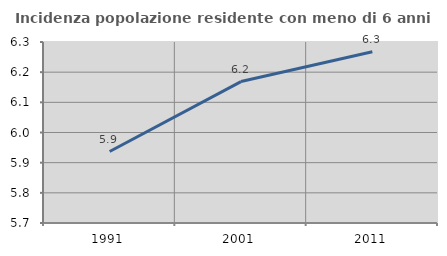
| Category | Incidenza popolazione residente con meno di 6 anni |
|---|---|
| 1991.0 | 5.937 |
| 2001.0 | 6.169 |
| 2011.0 | 6.268 |